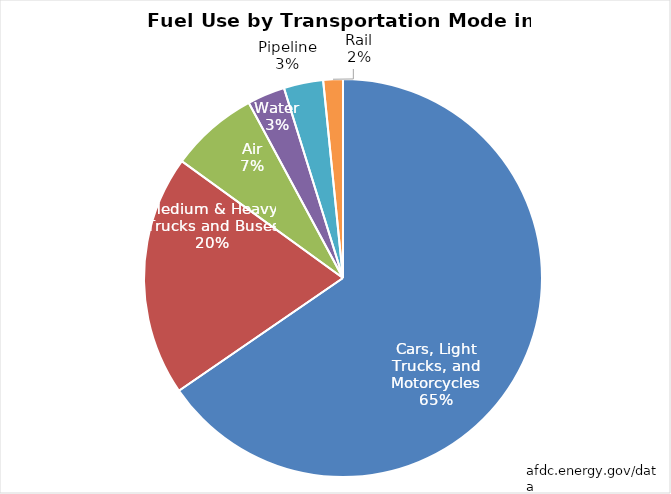
| Category | Series 0 |
|---|---|
| Cars, Light Trucks, and Motorcycles | 179596.932 |
| Medium & Heavy Trucks and Buses | 53702.793 |
| Air | 19676.012 |
| Water | 8400.871 |
| Pipeline | 8784.423 |
| Rail | 4379.749 |